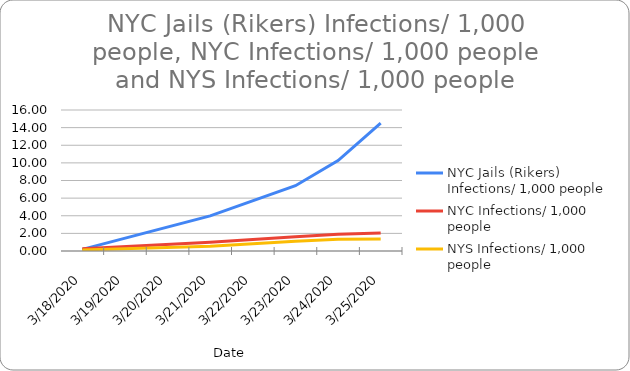
| Category | NYC Jails (Rikers) Infections/ 1,000 people | NYC Infections/ 1,000 people | NYS Infections/ 1,000 people |
|---|---|---|---|
| 3/18/20 | 0.19 | 0.246 | 0.123 |
| 3/21/20 | 3.987 | 0.993 | 0.533 |
| 3/23/20 | 7.405 | 1.605 | 1.116 |
| 3/24/20 | 10.253 | 1.908 | 1.32 |
| 3/25/20 | 14.51 | 2.054 | 1.357 |